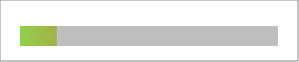
| Category | Series 0 |
|---|---|
| 0 | -0.3 |